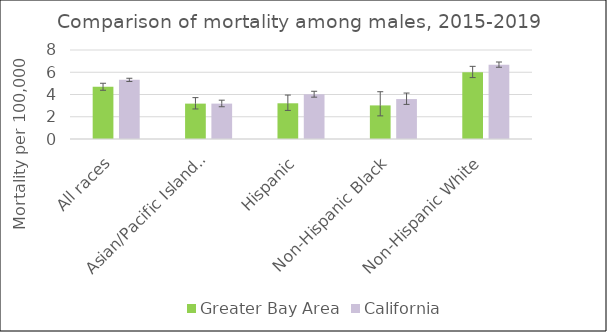
| Category | Greater Bay Area | California | US Mortality |
|---|---|---|---|
| All races | 4.69 | 5.32 |  |
| Asian/Pacific Islander | 3.18 | 3.18 |  |
| Hispanic | 3.21 | 4.02 |  |
| Non-Hispanic Black | 3.02 | 3.59 |  |
| Non-Hispanic White | 6.01 | 6.68 |  |